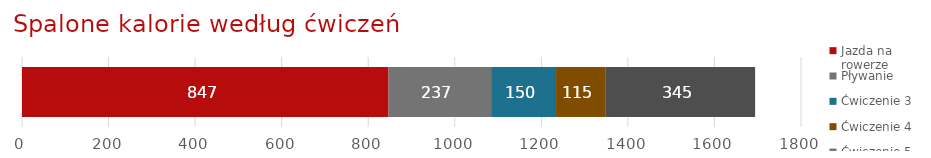
| Category | Jazda na rowerze | Pływanie | Ćwiczenie 3 | Ćwiczenie 4 | Ćwiczenie 5 |
|---|---|---|---|---|---|
| Śledzenie ćwiczeń | 847 | 237 | 150 | 115 | 345 |